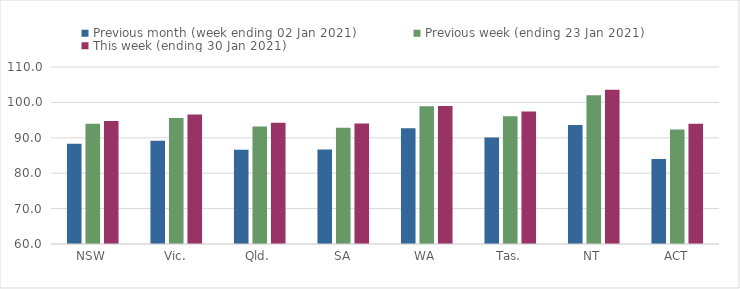
| Category | Previous month (week ending 02 Jan 2021) | Previous week (ending 23 Jan 2021) | This week (ending 30 Jan 2021) |
|---|---|---|---|
| NSW | 88.35 | 93.99 | 94.75 |
| Vic. | 89.2 | 95.62 | 96.55 |
| Qld. | 86.62 | 93.18 | 94.28 |
| SA | 86.72 | 92.86 | 94.07 |
| WA | 92.73 | 98.9 | 99 |
| Tas. | 90.05 | 96.11 | 97.43 |
| NT | 93.61 | 101.99 | 103.58 |
| ACT | 84.03 | 92.34 | 93.94 |